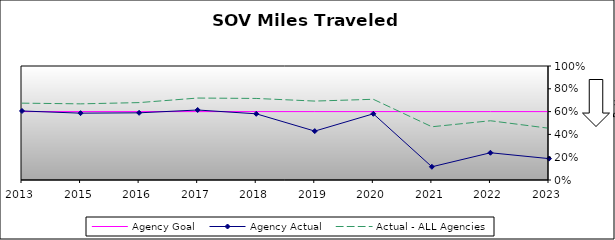
| Category | Agency Goal | Agency Actual | Actual - ALL Agencies |
|---|---|---|---|
| 2013.0 | 0.6 | 0.606 | 0.674 |
| 2015.0 | 0.6 | 0.586 | 0.668 |
| 2016.0 | 0.6 | 0.589 | 0.679 |
| 2017.0 | 0.6 | 0.614 | 0.719 |
| 2018.0 | 0.6 | 0.581 | 0.715 |
| 2019.0 | 0.6 | 0.429 | 0.692 |
| 2020.0 | 0.6 | 0.581 | 0.708 |
| 2021.0 | 0.6 | 0.116 | 0.467 |
| 2022.0 | 0.6 | 0.239 | 0.52 |
| 2023.0 | 0.6 | 0.188 | 0.454 |